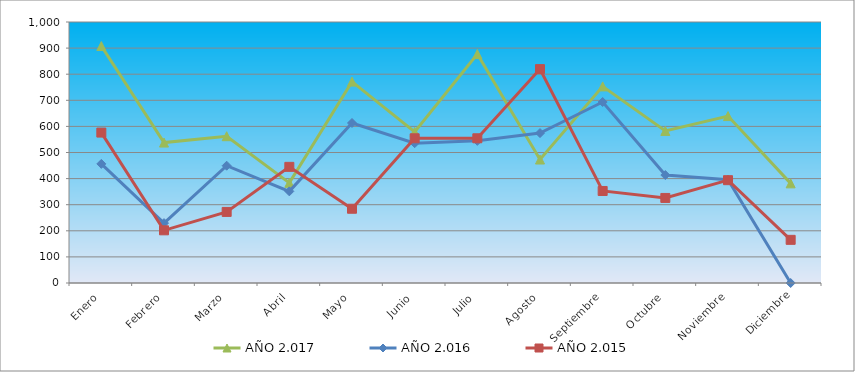
| Category | AÑO 2.017 | AÑO 2.016 | AÑO 2.015 |
|---|---|---|---|
| Enero | 907.879 | 456.411 | 576.324 |
| Febrero | 538.059 | 229.388 | 201.835 |
| Marzo | 562.424 | 449.375 | 272.356 |
| Abril | 383.748 | 351.167 | 445.01 |
| Mayo | 771.556 | 613.054 | 284.514 |
| Junio | 578.667 | 535.679 | 554.438 |
| Julio | 877.138 | 544.606 | 554.438 |
| Agosto | 473.086 | 574.366 | 819.499 |
| Septiembre | 753.283 | 693.406 | 352.603 |
| Octubre | 582.728 | 413.663 | 325.854 |
| Noviembre | 639.58 | 395.807 | 393.943 |
| Diciembre | 381.717 | 0 | 165.359 |